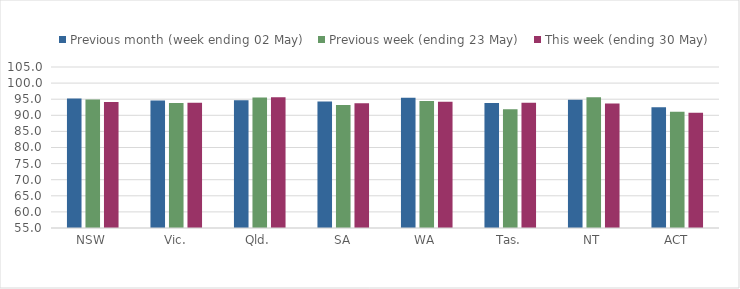
| Category | Previous month (week ending 02 May) | Previous week (ending 23 May) | This week (ending 30 May) |
|---|---|---|---|
| NSW | 95.216 | 94.934 | 94.158 |
| Vic. | 94.592 | 93.79 | 93.928 |
| Qld. | 94.675 | 95.5 | 95.578 |
| SA | 94.26 | 93.226 | 93.723 |
| WA | 95.469 | 94.417 | 94.232 |
| Tas. | 93.79 | 91.875 | 93.89 |
| NT | 94.799 | 95.614 | 93.672 |
| ACT | 92.517 | 91.123 | 90.775 |